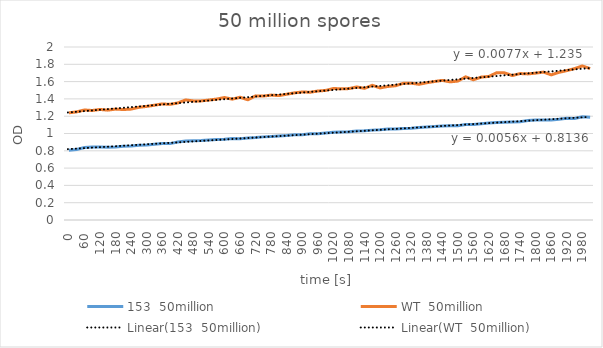
| Category | 153  50million | WT  50million |
|---|---|---|
| 0.0 | 0.807 | 1.239 |
| 30.0 | 0.815 | 1.25 |
| 60.0 | 0.839 | 1.272 |
| 90.0 | 0.843 | 1.266 |
| 120.0 | 0.844 | 1.278 |
| 150.0 | 0.842 | 1.27 |
| 180.0 | 0.845 | 1.282 |
| 210.0 | 0.853 | 1.277 |
| 240.0 | 0.856 | 1.282 |
| 270.0 | 0.865 | 1.303 |
| 300.0 | 0.868 | 1.313 |
| 330.0 | 0.876 | 1.327 |
| 360.0 | 0.883 | 1.342 |
| 390.0 | 0.883 | 1.337 |
| 420.0 | 0.901 | 1.353 |
| 450.0 | 0.912 | 1.388 |
| 480.0 | 0.915 | 1.377 |
| 510.0 | 0.918 | 1.377 |
| 540.0 | 0.926 | 1.387 |
| 570.0 | 0.93 | 1.398 |
| 600.0 | 0.934 | 1.416 |
| 630.0 | 0.942 | 1.397 |
| 660.0 | 0.939 | 1.419 |
| 690.0 | 0.947 | 1.39 |
| 720.0 | 0.953 | 1.435 |
| 750.0 | 0.961 | 1.433 |
| 780.0 | 0.966 | 1.444 |
| 810.0 | 0.972 | 1.438 |
| 840.0 | 0.976 | 1.454 |
| 870.0 | 0.985 | 1.47 |
| 900.0 | 0.985 | 1.48 |
| 930.0 | 0.996 | 1.477 |
| 960.0 | 0.998 | 1.491 |
| 990.0 | 1.007 | 1.498 |
| 1020.0 | 1.014 | 1.52 |
| 1050.0 | 1.016 | 1.517 |
| 1080.0 | 1.019 | 1.519 |
| 1110.0 | 1.028 | 1.538 |
| 1140.0 | 1.031 | 1.522 |
| 1170.0 | 1.039 | 1.557 |
| 1200.0 | 1.044 | 1.527 |
| 1230.0 | 1.053 | 1.544 |
| 1260.0 | 1.053 | 1.552 |
| 1290.0 | 1.059 | 1.581 |
| 1320.0 | 1.061 | 1.582 |
| 1350.0 | 1.068 | 1.569 |
| 1380.0 | 1.076 | 1.587 |
| 1410.0 | 1.08 | 1.601 |
| 1440.0 | 1.088 | 1.614 |
| 1470.0 | 1.089 | 1.597 |
| 1500.0 | 1.091 | 1.606 |
| 1530.0 | 1.103 | 1.655 |
| 1560.0 | 1.105 | 1.621 |
| 1590.0 | 1.112 | 1.652 |
| 1620.0 | 1.121 | 1.66 |
| 1650.0 | 1.126 | 1.703 |
| 1680.0 | 1.131 | 1.701 |
| 1710.0 | 1.134 | 1.67 |
| 1740.0 | 1.135 | 1.693 |
| 1770.0 | 1.15 | 1.689 |
| 1800.0 | 1.155 | 1.698 |
| 1830.0 | 1.155 | 1.71 |
| 1860.0 | 1.157 | 1.678 |
| 1890.0 | 1.165 | 1.707 |
| 1920.0 | 1.177 | 1.727 |
| 1950.0 | 1.174 | 1.75 |
| 1980.0 | 1.194 | 1.781 |
| 2010.0 | 1.189 | 1.751 |